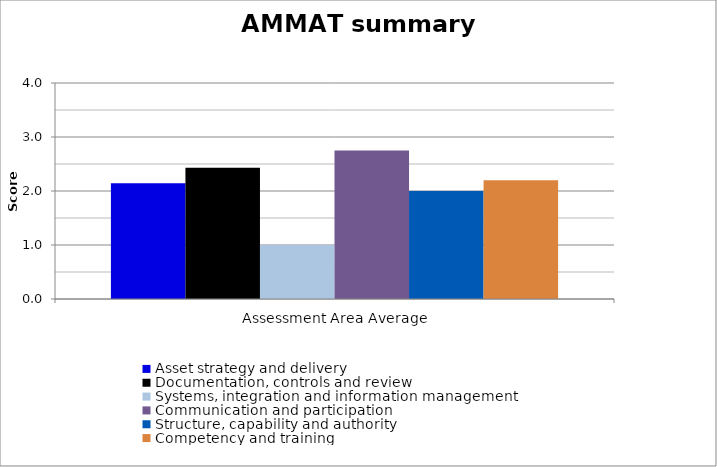
| Category | Asset strategy and delivery | Documentation, controls and review | Systems, integration and information management | Communication and participation | Structure, capability and authority | Competency and training |
|---|---|---|---|---|---|---|
|  Assessment Area Average | 2.143 | 2.429 | 1 | 2.75 | 2 | 2.2 |